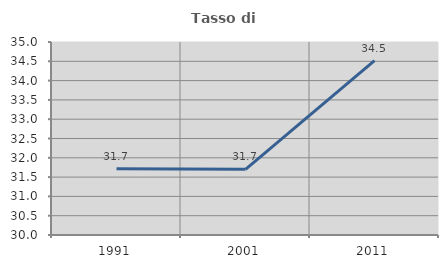
| Category | Tasso di occupazione   |
|---|---|
| 1991.0 | 31.715 |
| 2001.0 | 31.701 |
| 2011.0 | 34.517 |